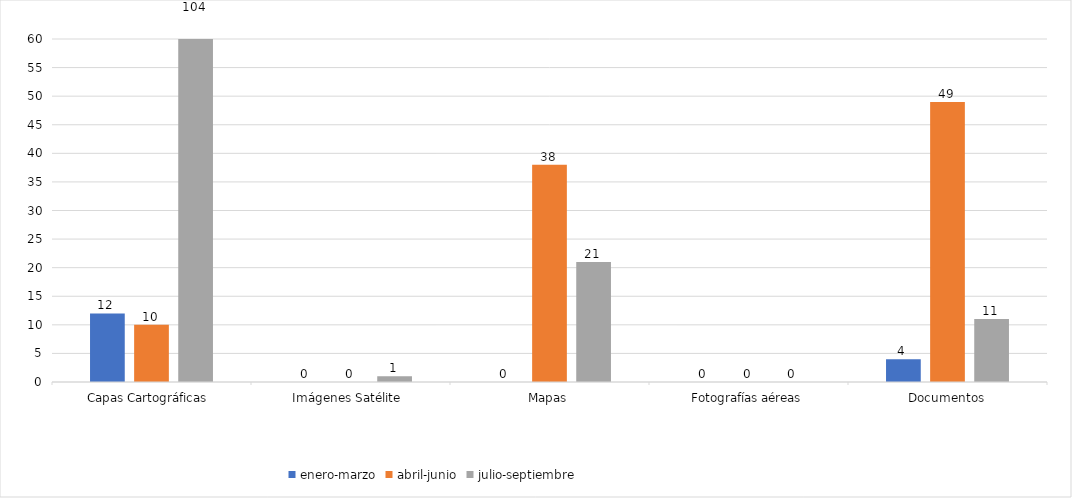
| Category | enero-marzo | abril-junio | julio-septiembre |
|---|---|---|---|
| Capas Cartográficas  | 12 | 10 | 104 |
| Imágenes Satélite  | 0 | 0 | 1 |
| Mapas | 0 | 38 | 21 |
| Fotografías aéreas | 0 | 0 | 0 |
| Documentos | 4 | 49 | 11 |